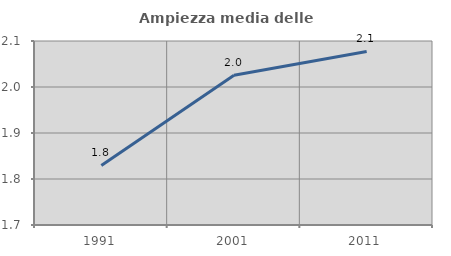
| Category | Ampiezza media delle famiglie |
|---|---|
| 1991.0 | 1.83 |
| 2001.0 | 2.026 |
| 2011.0 | 2.077 |